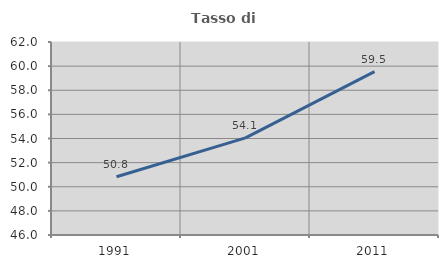
| Category | Tasso di occupazione   |
|---|---|
| 1991.0 | 50.832 |
| 2001.0 | 54.056 |
| 2011.0 | 59.547 |